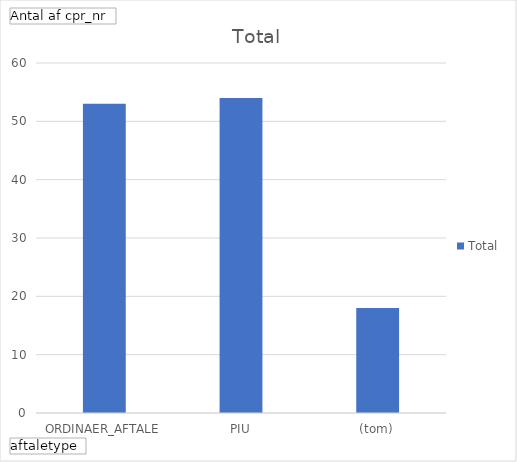
| Category | Total |
|---|---|
| ORDINAER_AFTALE | 53 |
| PIU | 54 |
| (tom) | 18 |